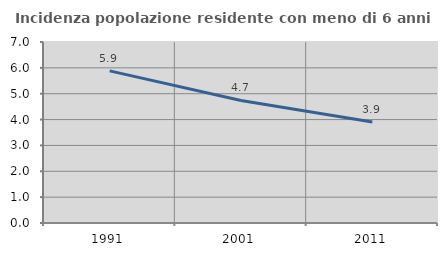
| Category | Incidenza popolazione residente con meno di 6 anni |
|---|---|
| 1991.0 | 5.882 |
| 2001.0 | 4.74 |
| 2011.0 | 3.905 |